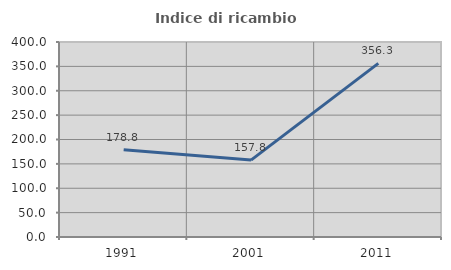
| Category | Indice di ricambio occupazionale  |
|---|---|
| 1991.0 | 178.788 |
| 2001.0 | 157.778 |
| 2011.0 | 356.25 |